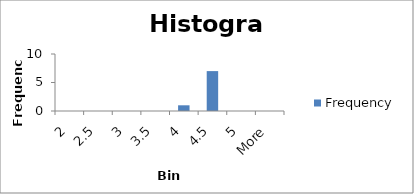
| Category | Frequency |
|---|---|
| 2 | 0 |
| 2.5 | 0 |
| 3 | 0 |
| 3.5 | 0 |
| 4 | 1 |
| 4.5 | 7 |
| 5 | 0 |
| More | 0 |